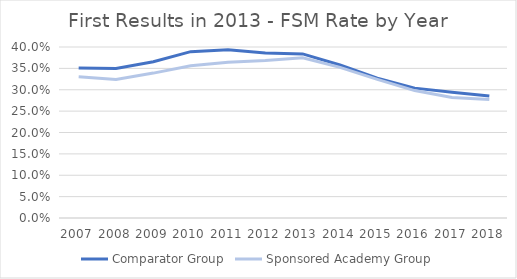
| Category | Comparator Group | Sponsored Academy Group |
|---|---|---|
| 2007.0 | 0.351 | 0.33 |
| 2008.0 | 0.35 | 0.324 |
| 2009.0 | 0.366 | 0.339 |
| 2010.0 | 0.389 | 0.356 |
| 2011.0 | 0.393 | 0.365 |
| 2012.0 | 0.386 | 0.368 |
| 2013.0 | 0.384 | 0.375 |
| 2014.0 | 0.358 | 0.352 |
| 2015.0 | 0.327 | 0.324 |
| 2016.0 | 0.304 | 0.298 |
| 2017.0 | 0.294 | 0.282 |
| 2018.0 | 0.285 | 0.277 |